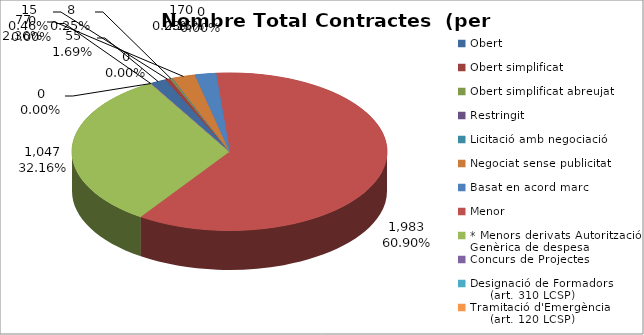
| Category | Nombre Total Contractes |
|---|---|
| Obert | 55 |
| Obert simplificat | 15 |
| Obert simplificat abreujat | 8 |
| Restringit | 0 |
| Licitació amb negociació | 1 |
| Negociat sense publicitat | 77 |
| Basat en acord marc | 70 |
| Menor | 1983 |
| * Menors derivats Autorització Genèrica de despesa | 1047 |
| Concurs de Projectes | 0 |
| Designació de Formadors
     (art. 310 LCSP) | 0 |
| Tramitació d'Emergència
     (art. 120 LCSP) | 0 |